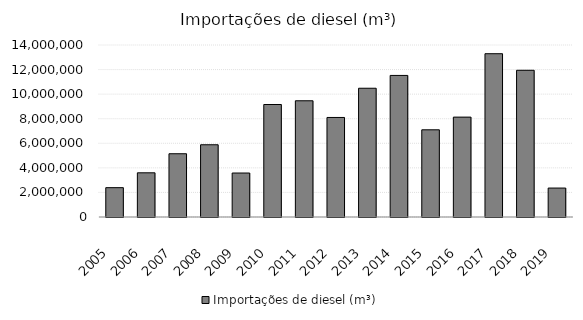
| Category | Importações de diesel (m³) |
|---|---|
| 2005.0 | 2387529.169 |
| 2006.0 | 3597490 |
| 2007.0 | 5149302.981 |
| 2008.0 | 5880761 |
| 2009.0 | 3578931 |
| 2010.0 | 9156621 |
| 2011.0 | 9460750 |
| 2012.0 | 8102598 |
| 2013.0 | 10479995 |
| 2014.0 | 11523795 |
| 2015.0 | 7096871 |
| 2016.0 | 8129754 |
| 2017.0 | 13291114 |
| 2018.0 | 11940982.451 |
| 2019.0 | 2356531.784 |